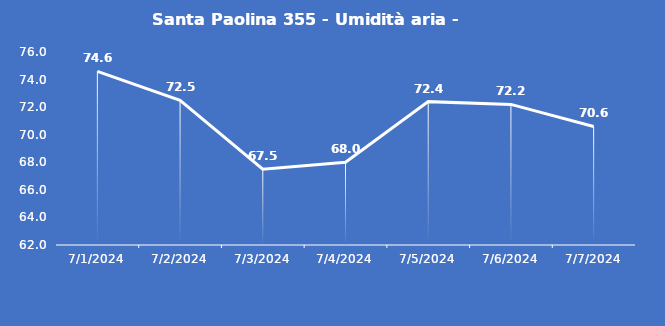
| Category | Santa Paolina 355 - Umidità aria - Grezzo (%) |
|---|---|
| 7/1/24 | 74.6 |
| 7/2/24 | 72.5 |
| 7/3/24 | 67.5 |
| 7/4/24 | 68 |
| 7/5/24 | 72.4 |
| 7/6/24 | 72.2 |
| 7/7/24 | 70.6 |